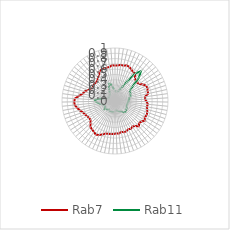
| Category | Rab7 | Rab11 |
|---|---|---|
| 0.0 | 0.668 | 0.199 |
| 0.10913 | 0.674 | 0.176 |
| 0.21825 | 0.69 | 0.173 |
| 0.32738 | 0.685 | 0.184 |
| 0.43651 | 0.71 | 0.2 |
| 0.54563 | 0.696 | 0.233 |
| 0.65476 | 0.671 | 0.295 |
| 0.76389 | 0.645 | 0.438 |
| 0.87302 | 0.644 | 0.648 |
| 0.98214 | 0.572 | 0.745 |
| 1.09127 | 0.546 | 0.632 |
| 1.2004 | 0.543 | 0.438 |
| 1.30952 | 0.554 | 0.351 |
| 1.41865 | 0.611 | 0.324 |
| 1.52778 | 0.653 | 0.328 |
| 1.6369 | 0.66 | 0.314 |
| 1.74603 | 0.642 | 0.308 |
| 1.85516 | 0.641 | 0.276 |
| 1.96429 | 0.57 | 0.274 |
| 2.07341 | 0.567 | 0.257 |
| 2.18254 | 0.596 | 0.258 |
| 2.29167 | 0.624 | 0.244 |
| 2.40079 | 0.61 | 0.237 |
| 2.50992 | 0.631 | 0.24 |
| 2.61905 | 0.642 | 0.241 |
| 2.72817 | 0.656 | 0.239 |
| 2.8373 | 0.639 | 0.256 |
| 2.94643 | 0.672 | 0.26 |
| 3.05556 | 0.634 | 0.268 |
| 3.16468 | 0.617 | 0.276 |
| 3.27381 | 0.656 | 0.285 |
| 3.38294 | 0.604 | 0.269 |
| 3.49206 | 0.584 | 0.251 |
| 3.60119 | 0.607 | 0.228 |
| 3.71032 | 0.587 | 0.217 |
| 3.81944 | 0.611 | 0.205 |
| 3.92857 | 0.612 | 0.191 |
| 4.0377 | 0.593 | 0.191 |
| 4.14683 | 0.621 | 0.176 |
| 4.25595 | 0.611 | 0.18 |
| 4.36508 | 0.625 | 0.206 |
| 4.47421 | 0.626 | 0.2 |
| 4.58333 | 0.632 | 0.212 |
| 4.69246 | 0.638 | 0.206 |
| 4.80159 | 0.673 | 0.21 |
| 4.91071 | 0.708 | 0.206 |
| 5.01984 | 0.732 | 0.21 |
| 5.12897 | 0.707 | 0.195 |
| 5.2381 | 0.69 | 0.215 |
| 5.34722 | 0.675 | 0.22 |
| 5.45635 | 0.623 | 0.226 |
| 5.56548 | 0.584 | 0.252 |
| 5.6746 | 0.582 | 0.23 |
| 5.78373 | 0.6 | 0.215 |
| 5.89286 | 0.621 | 0.213 |
| 6.00198 | 0.643 | 0.219 |
| 6.11111 | 0.688 | 0.247 |
| 6.22024 | 0.726 | 0.29 |
| 6.32937 | 0.764 | 0.324 |
| 6.43849 | 0.77 | 0.369 |
| 6.54762 | 0.759 | 0.378 |
| 6.65675 | 0.687 | 0.308 |
| 6.76587 | 0.628 | 0.209 |
| 6.875 | 0.603 | 0.151 |
| 6.98413 | 0.559 | 0.13 |
| 7.09325 | 0.511 | 0.132 |
| 7.20238 | 0.486 | 0.127 |
| 7.31151 | 0.504 | 0.133 |
| 7.42063 | 0.51 | 0.14 |
| 7.52976 | 0.5 | 0.145 |
| 7.63889 | 0.513 | 0.146 |
| 7.74802 | 0.542 | 0.167 |
| 7.85714 | 0.568 | 0.186 |
| 7.96627 | 0.633 | 0.239 |
| 8.0754 | 0.645 | 0.291 |
| 8.18452 | 0.646 | 0.341 |
| 8.29365 | 0.647 | 0.324 |
| 8.40278 | 0.651 | 0.262 |
| 8.5119 | 0.677 | 0.218 |